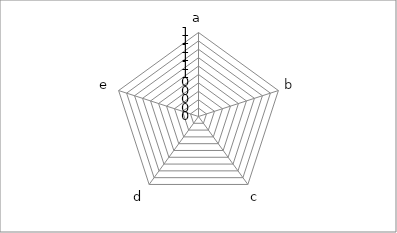
| Category | Series 0 |
|---|---|
| a | 0 |
| b | 0 |
| c | 0 |
| d | 0 |
| e | 0 |